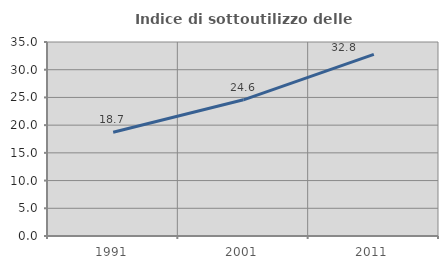
| Category | Indice di sottoutilizzo delle abitazioni  |
|---|---|
| 1991.0 | 18.728 |
| 2001.0 | 24.573 |
| 2011.0 | 32.781 |